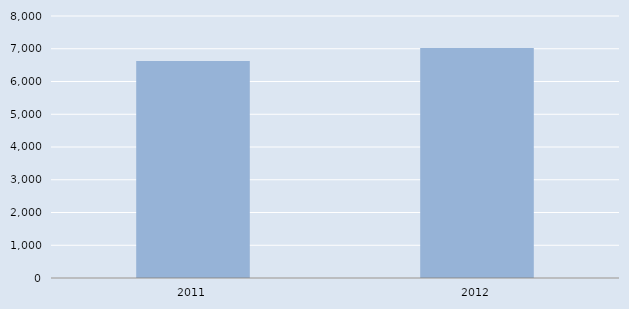
| Category | Series 0 |
|---|---|
| 2011.0 | 6624 |
| 2012.0 | 7023 |